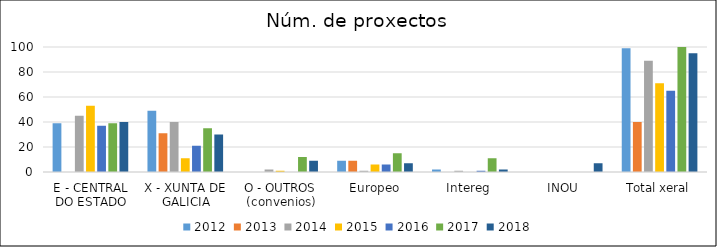
| Category | 2012 | 2013 | 2014 | 2015 | 2016 | 2017 | 2018 |
|---|---|---|---|---|---|---|---|
| E - CENTRAL DO ESTADO | 39 | 0 | 45 | 53 | 37 | 39 | 40 |
| X - XUNTA DE GALICIA | 49 | 31 | 40 | 11 | 21 | 35 | 30 |
| O - OUTROS (convenios) | 0 | 0 | 2 | 1 | 0 | 12 | 9 |
| Europeo | 9 | 9 | 1 | 6 | 6 | 15 | 7 |
| Intereg | 2 | 0 | 1 | 0 | 1 | 11 | 2 |
| INOU | 0 | 0 | 0 | 0 | 0 | 0 | 7 |
| Total xeral | 99 | 40 | 89 | 71 | 65 | 112 | 95 |